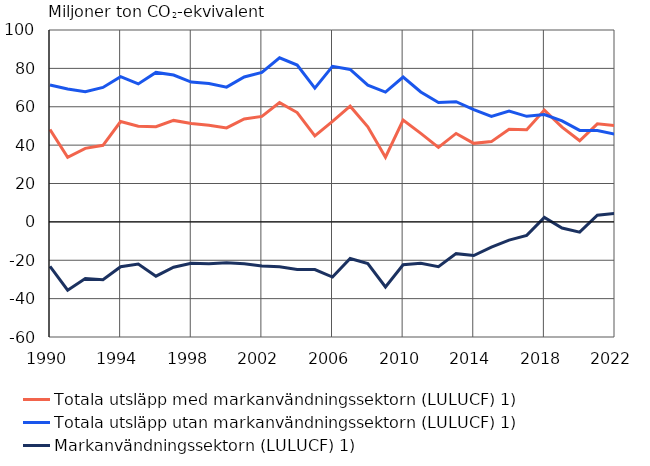
| Category | Totala utsläpp med markanvändningssektorn (LULUCF) 1) | Totala utsläpp utan markanvändningssektorn (LULUCF) 1) | Markanvändningssektorn (LULUCF) 1) |
|---|---|---|---|
| 1990.0 | 48.156 | 71.331 | -23.175 |
| 1991.0 | 33.667 | 69.247 | -35.58 |
| 1992.0 | 38.322 | 67.869 | -29.547 |
| 1993.0 | 39.893 | 70.077 | -30.184 |
| 1994.0 | 52.275 | 75.646 | -23.37 |
| 1995.0 | 49.889 | 71.89 | -22 |
| 1996.0 | 49.574 | 77.881 | -28.307 |
| 1997.0 | 52.88 | 76.539 | -23.659 |
| 1998.0 | 51.253 | 72.846 | -21.594 |
| 1999.0 | 50.395 | 72.162 | -21.766 |
| 2000.0 | 48.962 | 70.22 | -21.258 |
| 2001.0 | 53.661 | 75.537 | -21.876 |
| 2002.0 | 54.986 | 77.935 | -22.949 |
| 2003.0 | 62.155 | 85.521 | -23.366 |
| 2004.0 | 56.969 | 81.757 | -24.788 |
| 2005.0 | 44.863 | 69.713 | -24.85 |
| 2006.0 | 52.338 | 81.085 | -28.748 |
| 2007.0 | 60.312 | 79.413 | -19.101 |
| 2008.0 | 49.578 | 71.26 | -21.682 |
| 2009.0 | 33.723 | 67.63 | -33.906 |
| 2010.0 | 53.09 | 75.468 | -22.378 |
| 2011.0 | 46.1 | 67.72 | -21.62 |
| 2012.0 | 38.835 | 62.177 | -23.342 |
| 2013.0 | 46.089 | 62.646 | -16.557 |
| 2014.0 | 40.92 | 58.461 | -17.541 |
| 2015.0 | 41.83 | 54.961 | -13.131 |
| 2016.0 | 48.318 | 57.81 | -9.493 |
| 2017.0 | 47.972 | 55.003 | -7.032 |
| 2018.0 | 58.258 | 55.934 | 2.324 |
| 2019.0 | 49.413 | 52.646 | -3.233 |
| 2020.0 | 42.299 | 47.654 | -5.354 |
| 2021.0 | 51.078 | 47.604 | 3.474 |
| 2022.0 | 50.143 | 45.7 | 4.443 |